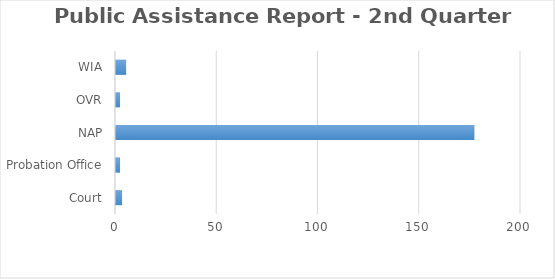
| Category | Series 0 |
|---|---|
| Court | 3 |
| Probation Office | 2 |
| NAP | 177 |
| OVR | 2 |
| WIA | 5 |